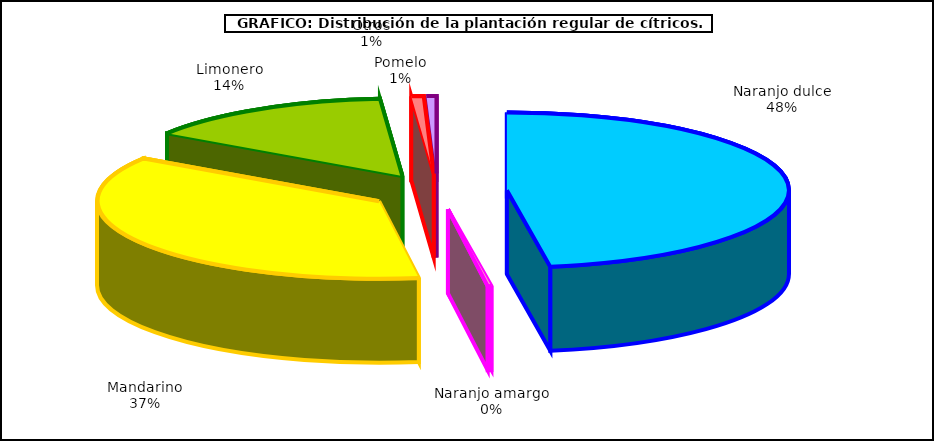
| Category | Series 0 |
|---|---|
| 0 | 139878 |
| 1 | 627 |
| 2 | 107515 |
| 3 | 42507 |
| 4 | 2066 |
| 5 | 1665 |